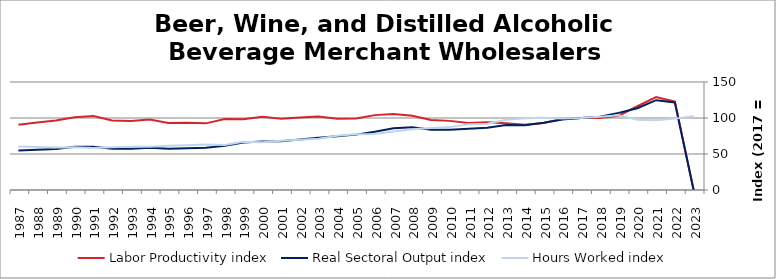
| Category | Labor Productivity index | Real Sectoral Output index | Hours Worked index |
|---|---|---|---|
| 2023.0 | 0 | 0 | 102.525 |
| 2022.0 | 122.7 | 121.635 | 99.132 |
| 2021.0 | 128.986 | 124.763 | 96.726 |
| 2020.0 | 116.299 | 113.506 | 97.599 |
| 2019.0 | 103.138 | 107.134 | 103.874 |
| 2018.0 | 100.124 | 101.895 | 101.768 |
| 2017.0 | 100 | 100 | 100 |
| 2016.0 | 98.57 | 98.055 | 99.477 |
| 2015.0 | 93.071 | 93.432 | 100.388 |
| 2014.0 | 90.495 | 90.097 | 99.56 |
| 2013.0 | 92.775 | 90.434 | 97.476 |
| 2012.0 | 93.969 | 86.422 | 91.968 |
| 2011.0 | 93.214 | 84.984 | 91.171 |
| 2010.0 | 96.007 | 83.848 | 87.336 |
| 2009.0 | 97.249 | 83.592 | 85.957 |
| 2008.0 | 103.102 | 87.135 | 84.513 |
| 2007.0 | 105.494 | 85.85 | 81.379 |
| 2006.0 | 103.994 | 81.029 | 77.917 |
| 2005.0 | 99.321 | 76.907 | 77.432 |
| 2004.0 | 99.126 | 74.647 | 75.305 |
| 2003.0 | 102.009 | 72.697 | 71.265 |
| 2002.0 | 100.758 | 70.239 | 69.711 |
| 2001.0 | 99.076 | 67.71 | 68.342 |
| 2000.0 | 101.678 | 67.304 | 66.193 |
| 1999.0 | 98.104 | 65.865 | 67.138 |
| 1998.0 | 98.718 | 61.598 | 62.398 |
| 1997.0 | 92.552 | 58.584 | 63.298 |
| 1996.0 | 93.312 | 57.971 | 62.126 |
| 1995.0 | 93.046 | 57.208 | 61.483 |
| 1994.0 | 97.822 | 58.658 | 59.964 |
| 1993.0 | 95.666 | 57.37 | 59.969 |
| 1992.0 | 96.559 | 57.461 | 59.509 |
| 1991.0 | 102.619 | 60.029 | 58.497 |
| 1990.0 | 100.951 | 60.098 | 59.532 |
| 1989.0 | 96.379 | 56.783 | 58.916 |
| 1988.0 | 93.708 | 55.947 | 59.703 |
| 1987.0 | 90.647 | 54.727 | 60.374 |